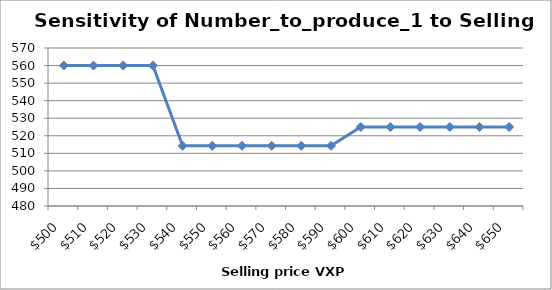
| Category | Series 0 |
|---|---|
| 500.0 | 560 |
| 510.0 | 560 |
| 520.0 | 560 |
| 530.0 | 560 |
| 540.0 | 514.286 |
| 550.0 | 514.286 |
| 560.0 | 514.286 |
| 570.0 | 514.286 |
| 580.0 | 514.286 |
| 590.0 | 514.286 |
| 600.0 | 525 |
| 610.0 | 525 |
| 620.0 | 525 |
| 630.0 | 525 |
| 640.0 | 525 |
| 650.0 | 525 |